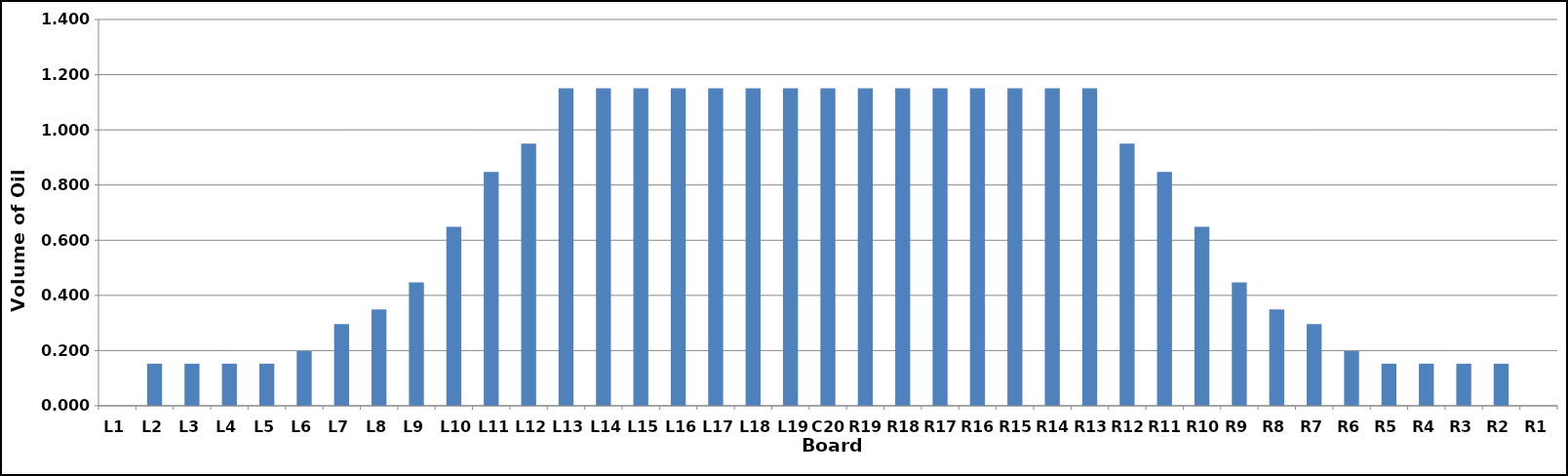
| Category | Series 0 |
|---|---|
| L1 | 0 |
| L2 | 0.153 |
| L3 | 0.153 |
| L4 | 0.153 |
| L5 | 0.153 |
| L6 | 0.198 |
| L7 | 0.296 |
| L8 | 0.349 |
| L9 | 0.447 |
| L10 | 0.649 |
| L11 | 0.848 |
| L12 | 0.95 |
| L13 | 1.151 |
| L14 | 1.151 |
| L15 | 1.151 |
| L16 | 1.151 |
| L17 | 1.151 |
| L18 | 1.151 |
| L19 | 1.151 |
| C20 | 1.151 |
| R19 | 1.151 |
| R18 | 1.151 |
| R17 | 1.151 |
| R16 | 1.151 |
| R15 | 1.151 |
| R14 | 1.151 |
| R13 | 1.151 |
| R12 | 0.95 |
| R11 | 0.848 |
| R10 | 0.649 |
| R9 | 0.447 |
| R8 | 0.349 |
| R7 | 0.296 |
| R6 | 0.198 |
| R5 | 0.153 |
| R4 | 0.153 |
| R3 | 0.153 |
| R2 | 0.153 |
| R1 | 0 |